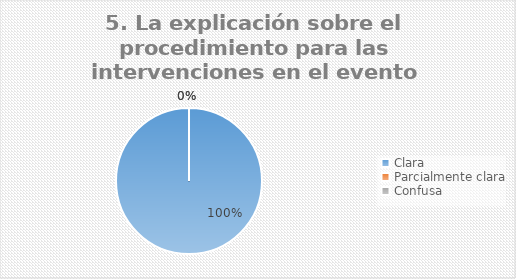
| Category | Series 0 |
|---|---|
| Clara | 9 |
| Parcialmente clara | 0 |
| Confusa | 0 |